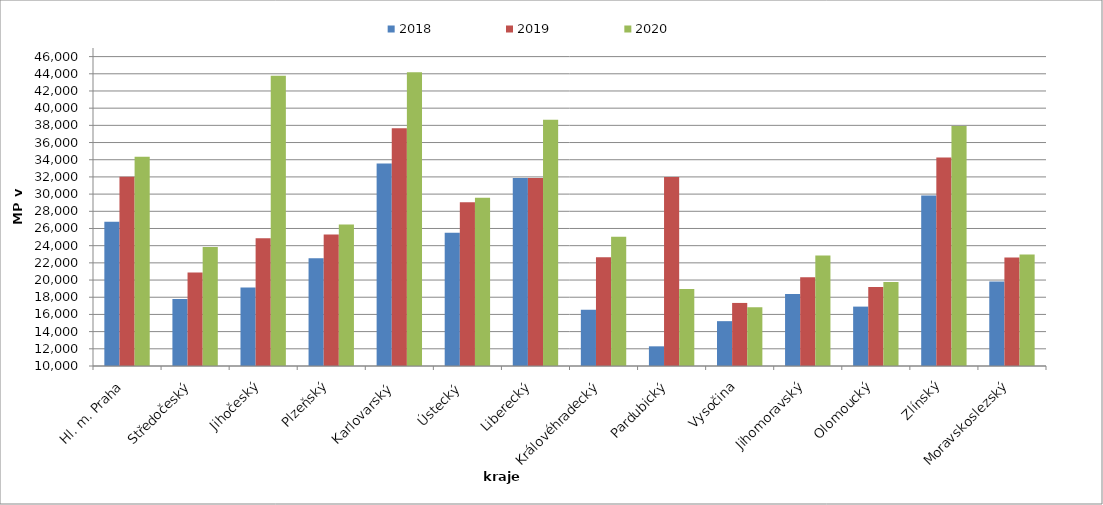
| Category | 2018 | 2019 | 2020 |
|---|---|---|---|
| Hl. m. Praha | 26774.084 | 32009.535 | 34345.561 |
| Středočeský | 17804.993 | 20865.042 | 23857.488 |
| Jihočeský | 19130.867 | 24862.058 | 43760.668 |
| Plzeňský | 22536.454 | 25314.079 | 26457.568 |
| Karlovarský  | 33547.126 | 37673.563 | 44180 |
| Ústecký   | 25512.945 | 29044.472 | 29569.799 |
| Liberecký | 31870.78 | 31870.78 | 38661.406 |
| Královéhradecký | 16545.126 | 22651.149 | 25049.7 |
| Pardubický | 12288.801 | 31979.016 | 18957.626 |
| Vysočina | 15217.612 | 17337.822 | 16836.188 |
| Jihomoravský | 18373.5 | 20320.773 | 22859.79 |
| Olomoucký | 16910.111 | 19191.794 | 19783.33 |
| Zlínský | 29847.319 | 34257.023 | 37934.812 |
| Moravskoslezský | 19835.437 | 22611.027 | 22987.799 |